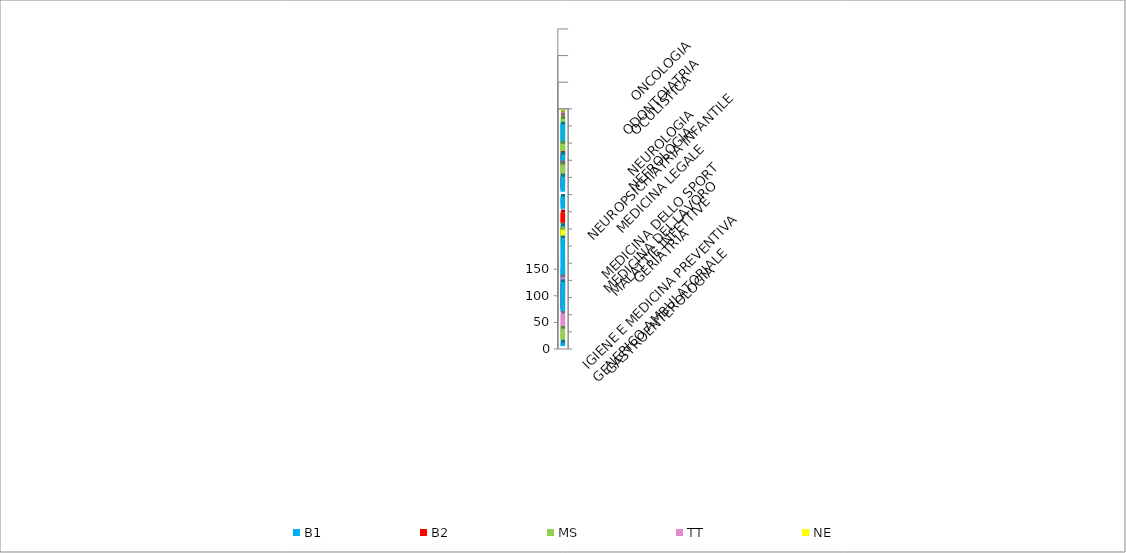
| Category | B1 | B2 | MS | TT | NE |
|---|---|---|---|---|---|
| GASTROENTEROLOGIA | 7 | 0 | 23 | 46 | 0 |
| GENERICO AMBULATORIALE | 0 | 0 | 0 | 0 | 0 |
| GERIATRIA | 56 | 47 | 37 | 50 | 36 |
| IGIENE E MEDICINA PREVENTIVA | 106 | 0 | 38 | 0 | 0 |
| MALATTIE INFETTIVE | 4 | 0 | 0 | 0 | 0 |
| MEDICINA DEL LAVORO | 0 | 0 | 0 | 0 | 38 |
| MEDICINA DELLO SPORT | 32 | 9 | 24 | 11 | 0 |
| MEDICINA LEGALE | 0 | 21 | 6 | 0 | 0 |
| NEFROLOGIA | 23 | 0 | 12 | 0 | 0 |
| NEUROLOGIA | 29 | 22 | 41 | 39 | 27 |
| NEUROPSICHIATRIA INFANTILE | 38 | 34 | 48 | 28 | 38 |
| OCULISTICA | 62 | 12 | 47 | 0 | 34 |
| ODONTOIATRIA | 28 | 0 | 30 | 11 | 10 |
| ONCOLOGIA | 0 | 0 | 0 | 0 | 0 |